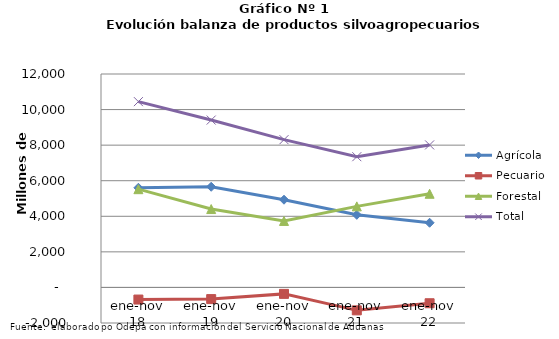
| Category | Agrícola | Pecuario | Forestal | Total |
|---|---|---|---|---|
| ene-nov 18 | 5603459 | -681642 | 5524149 | 10445966 |
| ene-nov 19 | 5658925 | -656228 | 4406874 | 9409571 |
| ene-nov 20 | 4932141 | -362821 | 3739043 | 8308363 |
| ene-nov 21 | 4082139 | -1288851 | 4557364 | 7350652 |
| ene-nov 22 | 3636123 | -889138 | 5266172 | 8013157 |